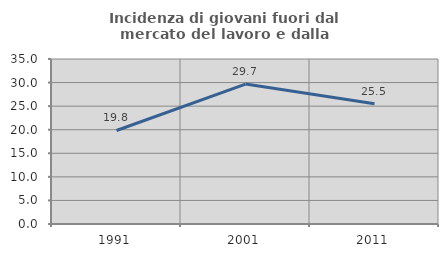
| Category | Incidenza di giovani fuori dal mercato del lavoro e dalla formazione  |
|---|---|
| 1991.0 | 19.84 |
| 2001.0 | 29.689 |
| 2011.0 | 25.495 |